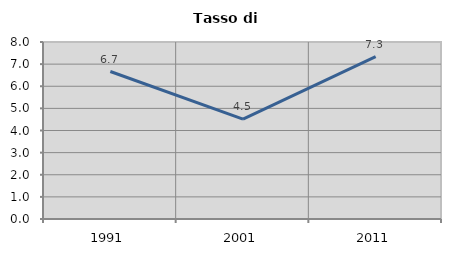
| Category | Tasso di disoccupazione   |
|---|---|
| 1991.0 | 6.667 |
| 2001.0 | 4.515 |
| 2011.0 | 7.341 |